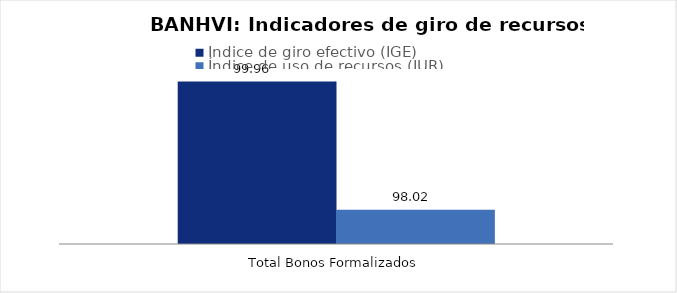
| Category | Índice de giro efectivo (IGE) | Índice de uso de recursos (IUR)  |
|---|---|---|
| Total Bonos Formalizados | 99.961 | 98.018 |